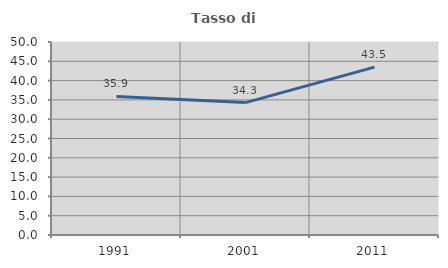
| Category | Tasso di occupazione   |
|---|---|
| 1991.0 | 35.893 |
| 2001.0 | 34.304 |
| 2011.0 | 43.478 |